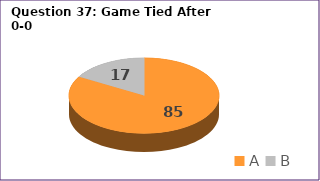
| Category | Series 0 |
|---|---|
| A | 85 |
| B | 17 |